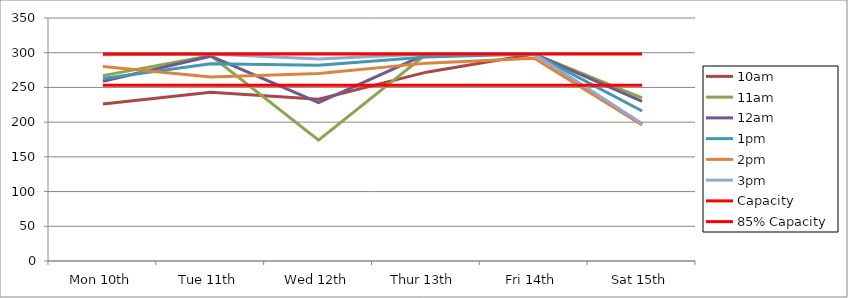
| Category | 9am | 10am | 11am | 12am | 1pm | 2pm | 3pm | 4pm | 5pm | Capacity | 85% Capacity |
|---|---|---|---|---|---|---|---|---|---|---|---|
| Mon 10th |  | 226 | 267 | 259 | 263 | 280 | 297 |  |  | 298 | 253 |
| Tue 11th |  | 243 | 296 | 295 | 284 | 265 | 298 |  |  | 298 | 253 |
| Wed 12th |  | 233 | 174 | 228 | 282 | 270 | 291 |  |  | 298 | 253 |
| Thur 13th |  | 272 | 298 | 298 | 294 | 285 | 298 |  |  | 298 | 253 |
| Fri 14th |  | 298 | 298 | 298 | 298 | 292 | 298 |  |  | 298 | 253 |
| Sat 15th |  | 197 | 235 | 230 | 216 | 196 | 198 |  |  | 298 | 253 |